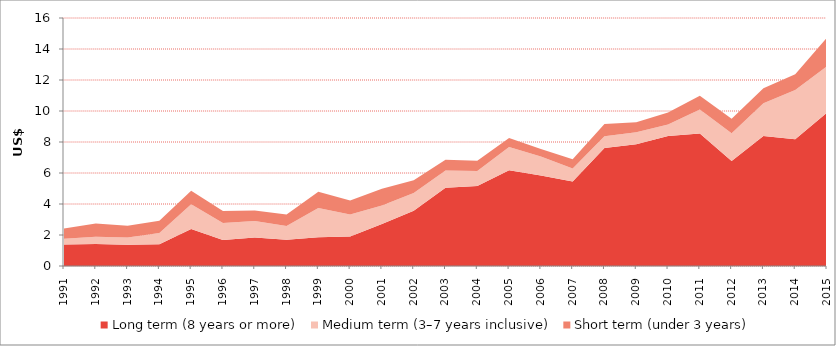
| Category | Long term (8 years or more) | Medium term (3–7 years inclusive) | Short term (under 3 years) |
|---|---|---|---|
| 1991.0 | 1.379 | 0.372 | 0.674 |
| 1992.0 | 1.426 | 0.465 | 0.848 |
| 1993.0 | 1.374 | 0.459 | 0.761 |
| 1994.0 | 1.408 | 0.715 | 0.799 |
| 1995.0 | 2.393 | 1.583 | 0.885 |
| 1996.0 | 1.675 | 1.102 | 0.778 |
| 1997.0 | 1.833 | 1.068 | 0.678 |
| 1998.0 | 1.687 | 0.89 | 0.737 |
| 1999.0 | 1.858 | 1.881 | 1.048 |
| 2000.0 | 1.903 | 1.412 | 0.912 |
| 2001.0 | 2.702 | 1.197 | 1.093 |
| 2002.0 | 3.565 | 1.141 | 0.826 |
| 2003.0 | 5.05 | 1.115 | 0.682 |
| 2004.0 | 5.161 | 0.971 | 0.665 |
| 2005.0 | 6.173 | 1.502 | 0.585 |
| 2006.0 | 5.843 | 1.227 | 0.485 |
| 2007.0 | 5.454 | 0.838 | 0.601 |
| 2008.0 | 7.608 | 0.769 | 0.786 |
| 2009.0 | 7.856 | 0.78 | 0.633 |
| 2010.0 | 8.393 | 0.742 | 0.767 |
| 2011.0 | 8.556 | 1.534 | 0.898 |
| 2012.0 | 6.779 | 1.792 | 0.928 |
| 2013.0 | 8.392 | 2.102 | 0.967 |
| 2014.0 | 8.18 | 3.172 | 1.018 |
| 2015.0 | 9.898 | 2.995 | 1.834 |